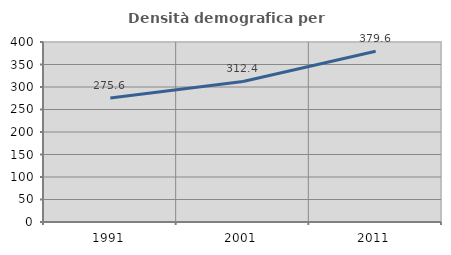
| Category | Densità demografica |
|---|---|
| 1991.0 | 275.569 |
| 2001.0 | 312.411 |
| 2011.0 | 379.56 |